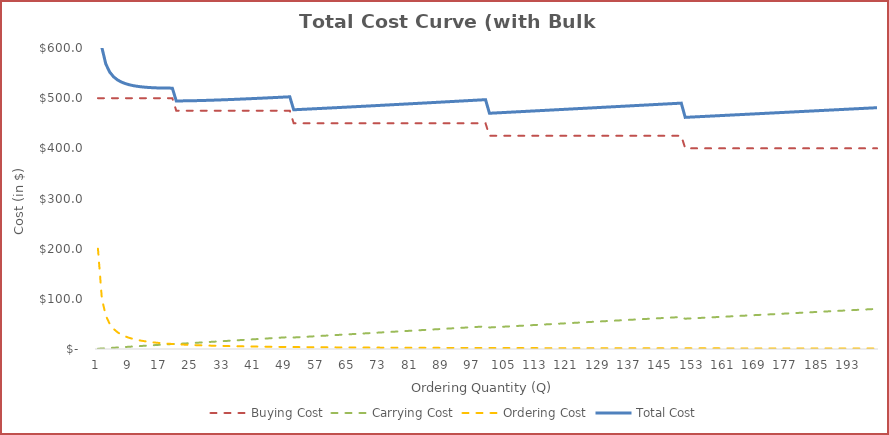
| Category | Buying Cost | Carrying Cost | Ordering Cost | Total Cost |
|---|---|---|---|---|
| 0 | 500 | 0.5 | 200 | 700.5 |
| 1 | 500 | 1 | 100 | 601 |
| 2 | 500 | 1.5 | 66.667 | 568.167 |
| 3 | 500 | 2 | 50 | 552 |
| 4 | 500 | 2.5 | 40 | 542.5 |
| 5 | 500 | 3 | 33.333 | 536.333 |
| 6 | 500 | 3.5 | 28.571 | 532.071 |
| 7 | 500 | 4 | 25 | 529 |
| 8 | 500 | 4.5 | 22.222 | 526.722 |
| 9 | 500 | 5 | 20 | 525 |
| 10 | 500 | 5.5 | 18.182 | 523.682 |
| 11 | 500 | 6 | 16.667 | 522.667 |
| 12 | 500 | 6.5 | 15.385 | 521.885 |
| 13 | 500 | 7 | 14.286 | 521.286 |
| 14 | 500 | 7.5 | 13.333 | 520.833 |
| 15 | 500 | 8 | 12.5 | 520.5 |
| 16 | 500 | 8.5 | 11.765 | 520.265 |
| 17 | 500 | 9 | 11.111 | 520.111 |
| 18 | 500 | 9.5 | 10.526 | 520.026 |
| 19 | 500 | 10 | 10 | 520 |
| 20 | 475 | 9.975 | 9.524 | 494.499 |
| 21 | 475 | 10.45 | 9.091 | 494.541 |
| 22 | 475 | 10.925 | 8.696 | 494.621 |
| 23 | 475 | 11.4 | 8.333 | 494.733 |
| 24 | 475 | 11.875 | 8 | 494.875 |
| 25 | 475 | 12.35 | 7.692 | 495.042 |
| 26 | 475 | 12.825 | 7.407 | 495.232 |
| 27 | 475 | 13.3 | 7.143 | 495.443 |
| 28 | 475 | 13.775 | 6.897 | 495.672 |
| 29 | 475 | 14.25 | 6.667 | 495.917 |
| 30 | 475 | 14.725 | 6.452 | 496.177 |
| 31 | 475 | 15.2 | 6.25 | 496.45 |
| 32 | 475 | 15.675 | 6.061 | 496.736 |
| 33 | 475 | 16.15 | 5.882 | 497.032 |
| 34 | 475 | 16.625 | 5.714 | 497.339 |
| 35 | 475 | 17.1 | 5.556 | 497.656 |
| 36 | 475 | 17.575 | 5.405 | 497.98 |
| 37 | 475 | 18.05 | 5.263 | 498.313 |
| 38 | 475 | 18.525 | 5.128 | 498.653 |
| 39 | 475 | 19 | 5 | 499 |
| 40 | 475 | 19.475 | 4.878 | 499.353 |
| 41 | 475 | 19.95 | 4.762 | 499.712 |
| 42 | 475 | 20.425 | 4.651 | 500.076 |
| 43 | 475 | 20.9 | 4.545 | 500.445 |
| 44 | 475 | 21.375 | 4.444 | 500.819 |
| 45 | 475 | 21.85 | 4.348 | 501.198 |
| 46 | 475 | 22.325 | 4.255 | 501.58 |
| 47 | 475 | 22.8 | 4.167 | 501.967 |
| 48 | 475 | 23.275 | 4.082 | 502.357 |
| 49 | 475 | 23.75 | 4 | 502.75 |
| 50 | 450 | 22.95 | 3.922 | 476.872 |
| 51 | 450 | 23.4 | 3.846 | 477.246 |
| 52 | 450 | 23.85 | 3.774 | 477.624 |
| 53 | 450 | 24.3 | 3.704 | 478.004 |
| 54 | 450 | 24.75 | 3.636 | 478.386 |
| 55 | 450 | 25.2 | 3.571 | 478.771 |
| 56 | 450 | 25.65 | 3.509 | 479.159 |
| 57 | 450 | 26.1 | 3.448 | 479.548 |
| 58 | 450 | 26.55 | 3.39 | 479.94 |
| 59 | 450 | 27 | 3.333 | 480.333 |
| 60 | 450 | 27.45 | 3.279 | 480.729 |
| 61 | 450 | 27.9 | 3.226 | 481.126 |
| 62 | 450 | 28.35 | 3.175 | 481.525 |
| 63 | 450 | 28.8 | 3.125 | 481.925 |
| 64 | 450 | 29.25 | 3.077 | 482.327 |
| 65 | 450 | 29.7 | 3.03 | 482.73 |
| 66 | 450 | 30.15 | 2.985 | 483.135 |
| 67 | 450 | 30.6 | 2.941 | 483.541 |
| 68 | 450 | 31.05 | 2.899 | 483.949 |
| 69 | 450 | 31.5 | 2.857 | 484.357 |
| 70 | 450 | 31.95 | 2.817 | 484.767 |
| 71 | 450 | 32.4 | 2.778 | 485.178 |
| 72 | 450 | 32.85 | 2.74 | 485.59 |
| 73 | 450 | 33.3 | 2.703 | 486.003 |
| 74 | 450 | 33.75 | 2.667 | 486.417 |
| 75 | 450 | 34.2 | 2.632 | 486.832 |
| 76 | 450 | 34.65 | 2.597 | 487.247 |
| 77 | 450 | 35.1 | 2.564 | 487.664 |
| 78 | 450 | 35.55 | 2.532 | 488.082 |
| 79 | 450 | 36 | 2.5 | 488.5 |
| 80 | 450 | 36.45 | 2.469 | 488.919 |
| 81 | 450 | 36.9 | 2.439 | 489.339 |
| 82 | 450 | 37.35 | 2.41 | 489.76 |
| 83 | 450 | 37.8 | 2.381 | 490.181 |
| 84 | 450 | 38.25 | 2.353 | 490.603 |
| 85 | 450 | 38.7 | 2.326 | 491.026 |
| 86 | 450 | 39.15 | 2.299 | 491.449 |
| 87 | 450 | 39.6 | 2.273 | 491.873 |
| 88 | 450 | 40.05 | 2.247 | 492.297 |
| 89 | 450 | 40.5 | 2.222 | 492.722 |
| 90 | 450 | 40.95 | 2.198 | 493.148 |
| 91 | 450 | 41.4 | 2.174 | 493.574 |
| 92 | 450 | 41.85 | 2.151 | 494.001 |
| 93 | 450 | 42.3 | 2.128 | 494.428 |
| 94 | 450 | 42.75 | 2.105 | 494.855 |
| 95 | 450 | 43.2 | 2.083 | 495.283 |
| 96 | 450 | 43.65 | 2.062 | 495.712 |
| 97 | 450 | 44.1 | 2.041 | 496.141 |
| 98 | 450 | 44.55 | 2.02 | 496.57 |
| 99 | 450 | 45 | 2 | 497 |
| 100 | 425 | 42.925 | 1.98 | 469.905 |
| 101 | 425 | 43.35 | 1.961 | 470.311 |
| 102 | 425 | 43.775 | 1.942 | 470.717 |
| 103 | 425 | 44.2 | 1.923 | 471.123 |
| 104 | 425 | 44.625 | 1.905 | 471.53 |
| 105 | 425 | 45.05 | 1.887 | 471.937 |
| 106 | 425 | 45.475 | 1.869 | 472.344 |
| 107 | 425 | 45.9 | 1.852 | 472.752 |
| 108 | 425 | 46.325 | 1.835 | 473.16 |
| 109 | 425 | 46.75 | 1.818 | 473.568 |
| 110 | 425 | 47.175 | 1.802 | 473.977 |
| 111 | 425 | 47.6 | 1.786 | 474.386 |
| 112 | 425 | 48.025 | 1.77 | 474.795 |
| 113 | 425 | 48.45 | 1.754 | 475.204 |
| 114 | 425 | 48.875 | 1.739 | 475.614 |
| 115 | 425 | 49.3 | 1.724 | 476.024 |
| 116 | 425 | 49.725 | 1.709 | 476.434 |
| 117 | 425 | 50.15 | 1.695 | 476.845 |
| 118 | 425 | 50.575 | 1.681 | 477.256 |
| 119 | 425 | 51 | 1.667 | 477.667 |
| 120 | 425 | 51.425 | 1.653 | 478.078 |
| 121 | 425 | 51.85 | 1.639 | 478.489 |
| 122 | 425 | 52.275 | 1.626 | 478.901 |
| 123 | 425 | 52.7 | 1.613 | 479.313 |
| 124 | 425 | 53.125 | 1.6 | 479.725 |
| 125 | 425 | 53.55 | 1.587 | 480.137 |
| 126 | 425 | 53.975 | 1.575 | 480.55 |
| 127 | 425 | 54.4 | 1.562 | 480.962 |
| 128 | 425 | 54.825 | 1.55 | 481.375 |
| 129 | 425 | 55.25 | 1.538 | 481.788 |
| 130 | 425 | 55.675 | 1.527 | 482.202 |
| 131 | 425 | 56.1 | 1.515 | 482.615 |
| 132 | 425 | 56.525 | 1.504 | 483.029 |
| 133 | 425 | 56.95 | 1.493 | 483.443 |
| 134 | 425 | 57.375 | 1.481 | 483.856 |
| 135 | 425 | 57.8 | 1.471 | 484.271 |
| 136 | 425 | 58.225 | 1.46 | 484.685 |
| 137 | 425 | 58.65 | 1.449 | 485.099 |
| 138 | 425 | 59.075 | 1.439 | 485.514 |
| 139 | 425 | 59.5 | 1.429 | 485.929 |
| 140 | 425 | 59.925 | 1.418 | 486.343 |
| 141 | 425 | 60.35 | 1.408 | 486.758 |
| 142 | 425 | 60.775 | 1.399 | 487.174 |
| 143 | 425 | 61.2 | 1.389 | 487.589 |
| 144 | 425 | 61.625 | 1.379 | 488.004 |
| 145 | 425 | 62.05 | 1.37 | 488.42 |
| 146 | 425 | 62.475 | 1.361 | 488.836 |
| 147 | 425 | 62.9 | 1.351 | 489.251 |
| 148 | 425 | 63.325 | 1.342 | 489.667 |
| 149 | 425 | 63.75 | 1.333 | 490.083 |
| 150 | 400 | 60.4 | 1.325 | 461.725 |
| 151 | 400 | 60.8 | 1.316 | 462.116 |
| 152 | 400 | 61.2 | 1.307 | 462.507 |
| 153 | 400 | 61.6 | 1.299 | 462.899 |
| 154 | 400 | 62 | 1.29 | 463.29 |
| 155 | 400 | 62.4 | 1.282 | 463.682 |
| 156 | 400 | 62.8 | 1.274 | 464.074 |
| 157 | 400 | 63.2 | 1.266 | 464.466 |
| 158 | 400 | 63.6 | 1.258 | 464.858 |
| 159 | 400 | 64 | 1.25 | 465.25 |
| 160 | 400 | 64.4 | 1.242 | 465.642 |
| 161 | 400 | 64.8 | 1.235 | 466.035 |
| 162 | 400 | 65.2 | 1.227 | 466.427 |
| 163 | 400 | 65.6 | 1.22 | 466.82 |
| 164 | 400 | 66 | 1.212 | 467.212 |
| 165 | 400 | 66.4 | 1.205 | 467.605 |
| 166 | 400 | 66.8 | 1.198 | 467.998 |
| 167 | 400 | 67.2 | 1.19 | 468.39 |
| 168 | 400 | 67.6 | 1.183 | 468.783 |
| 169 | 400 | 68 | 1.176 | 469.176 |
| 170 | 400 | 68.4 | 1.17 | 469.57 |
| 171 | 400 | 68.8 | 1.163 | 469.963 |
| 172 | 400 | 69.2 | 1.156 | 470.356 |
| 173 | 400 | 69.6 | 1.149 | 470.749 |
| 174 | 400 | 70 | 1.143 | 471.143 |
| 175 | 400 | 70.4 | 1.136 | 471.536 |
| 176 | 400 | 70.8 | 1.13 | 471.93 |
| 177 | 400 | 71.2 | 1.124 | 472.324 |
| 178 | 400 | 71.6 | 1.117 | 472.717 |
| 179 | 400 | 72 | 1.111 | 473.111 |
| 180 | 400 | 72.4 | 1.105 | 473.505 |
| 181 | 400 | 72.8 | 1.099 | 473.899 |
| 182 | 400 | 73.2 | 1.093 | 474.293 |
| 183 | 400 | 73.6 | 1.087 | 474.687 |
| 184 | 400 | 74 | 1.081 | 475.081 |
| 185 | 400 | 74.4 | 1.075 | 475.475 |
| 186 | 400 | 74.8 | 1.07 | 475.87 |
| 187 | 400 | 75.2 | 1.064 | 476.264 |
| 188 | 400 | 75.6 | 1.058 | 476.658 |
| 189 | 400 | 76 | 1.053 | 477.053 |
| 190 | 400 | 76.4 | 1.047 | 477.447 |
| 191 | 400 | 76.8 | 1.042 | 477.842 |
| 192 | 400 | 77.2 | 1.036 | 478.236 |
| 193 | 400 | 77.6 | 1.031 | 478.631 |
| 194 | 400 | 78 | 1.026 | 479.026 |
| 195 | 400 | 78.4 | 1.02 | 479.42 |
| 196 | 400 | 78.8 | 1.015 | 479.815 |
| 197 | 400 | 79.2 | 1.01 | 480.21 |
| 198 | 400 | 79.6 | 1.005 | 480.605 |
| 199 | 400 | 80 | 1 | 481 |